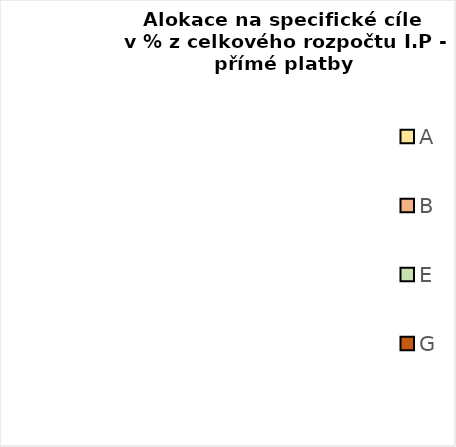
| Category | Series 0 |
|---|---|
| A | 0 |
| B | 0 |
| E | 0 |
| G | 0 |